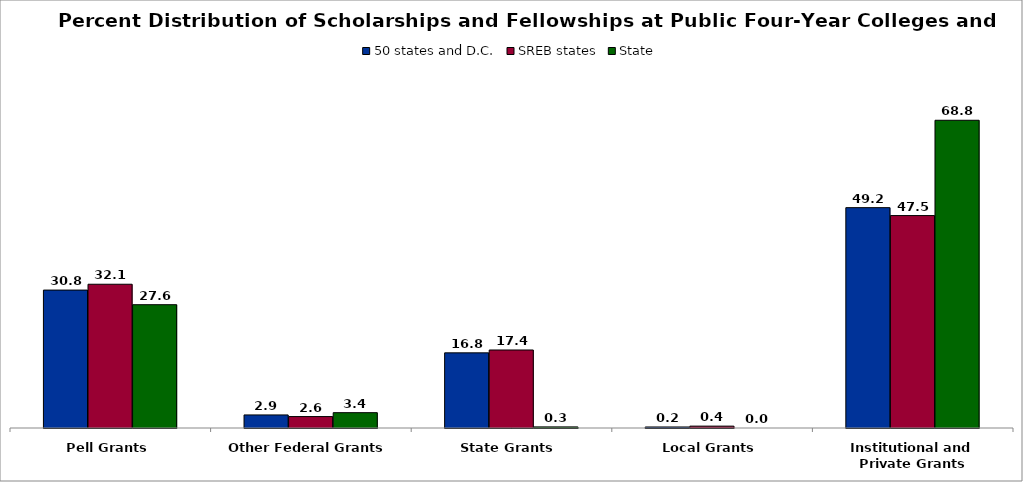
| Category | 50 states and D.C. | SREB states | State |
|---|---|---|---|
| Pell Grants | 30.819 | 32.124 | 27.555 |
| Other Federal Grants | 2.921 | 2.555 | 3.429 |
| State Grants | 16.793 | 17.432 | 0.251 |
| Local Grants | 0.228 | 0.418 | 0 |
| Institutional and Private Grants | 49.239 | 47.471 | 68.764 |